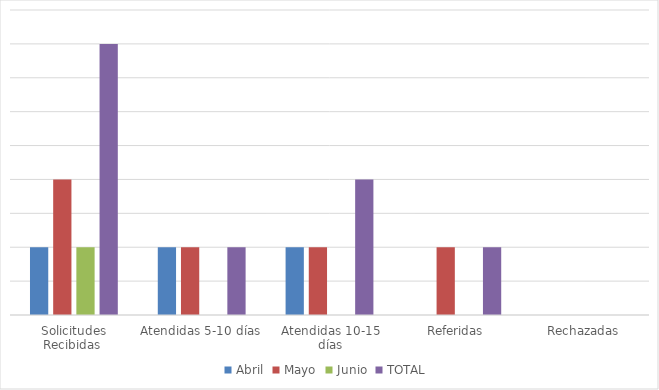
| Category | Abril | Mayo | Junio | TOTAL  |
|---|---|---|---|---|
| Solicitudes Recibidas  | 1 | 2 | 1 | 4 |
| Atendidas 5-10 días | 1 | 1 | 0 | 1 |
| Atendidas 10-15 días | 1 | 1 | 0 | 2 |
| Referidas | 0 | 1 | 0 | 1 |
| Rechazadas | 0 | 0 | 0 | 0 |